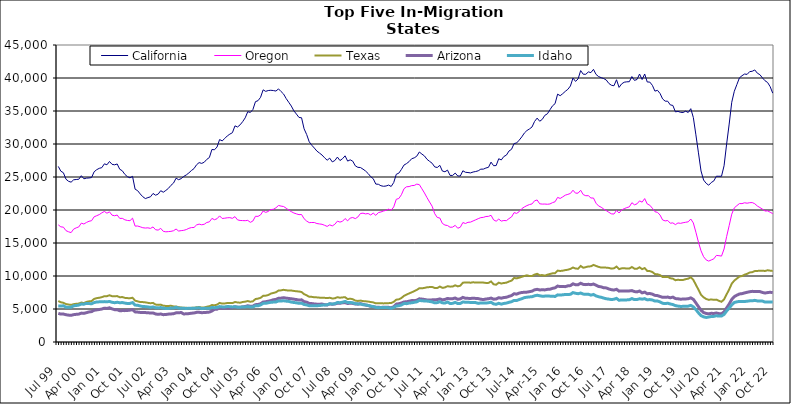
| Category | California | Oregon | Texas | Arizona | Idaho |
|---|---|---|---|---|---|
| Jul 99 | 26605 | 17749 | 6209 | 4339 | 5471 |
| Aug 99 | 25882 | 17447 | 6022 | 4228 | 5444 |
| Sep 99 | 25644 | 17401 | 5941 | 4237 | 5488 |
| Oct 99 | 24669 | 16875 | 5751 | 4134 | 5279 |
| Nov 99 | 24353 | 16701 | 5680 | 4073 | 5260 |
| Dec 99 | 24218 | 16570 | 5619 | 4042 | 5269 |
| Jan 00 | 24574 | 17109 | 5736 | 4142 | 5485 |
| Feb 00 | 24620 | 17295 | 5789 | 4192 | 5530 |
| Mar 00 | 24655 | 17436 | 5826 | 4226 | 5590 |
| Apr 00 | 25195 | 18009 | 5980 | 4375 | 5748 |
| May 00 | 24730 | 17875 | 5897 | 4337 | 5729 |
| Jun 00 | 24825 | 18113 | 6070 | 4444 | 5853 |
| Jul 00 | 24857 | 18294 | 6163 | 4555 | 5824 |
| Aug 00 | 24913 | 18376 | 6199 | 4603 | 5788 |
| Sep 00 | 25792 | 18971 | 6529 | 4804 | 5976 |
| Oct 00 | 26106 | 19135 | 6643 | 4870 | 6058 |
| Nov 00 | 26315 | 19306 | 6705 | 4926 | 6085 |
| Dec 00 | 26415 | 19570 | 6793 | 4991 | 6096 |
| Jan 01 | 26995 | 19781 | 6942 | 5122 | 6119 |
| Feb 01 | 26851 | 19519 | 6948 | 5089 | 6090 |
| Mar 01 | 27352 | 19720 | 7080 | 5180 | 6143 |
| Apr 01 | 26918 | 19221 | 6943 | 5020 | 6020 |
| May 01 | 26848 | 19126 | 6924 | 4899 | 5950 |
| Jun 01 | 26974 | 19241 | 6959 | 4895 | 6019 |
| Jul 01 | 26172 | 18725 | 6778 | 4737 | 5951 |
| Aug 01 | 25943 | 18736 | 6810 | 4757 | 5973 |
| Sep 01 | 25399 | 18514 | 6688 | 4753 | 5895 |
| Oct 01 | 25050 | 18415 | 6650 | 4780 | 5833 |
| Nov 01 | 24873 | 18381 | 6631 | 4826 | 5850 |
| Dec 01 | 25099 | 18765 | 6708 | 4898 | 5969 |
| Jan 02 | 23158 | 17561 | 6261 | 4560 | 5595 |
| Feb 02 | 22926 | 17573 | 6162 | 4531 | 5560 |
| Mar 02 | 22433 | 17452 | 6052 | 4481 | 5458 |
| Apr 02 | 22012 | 17314 | 6046 | 4458 | 5380 |
| May 02 | 21733 | 17267 | 6007 | 4452 | 5358 |
| Jun 02 | 21876 | 17298 | 5933 | 4444 | 5315 |
| Jul 02 | 21997 | 17209 | 5873 | 4383 | 5243 |
| Aug 02 | 22507 | 17436 | 5929 | 4407 | 5315 |
| Sep 02 | 22244 | 17010 | 5672 | 4248 | 5192 |
| Oct 02 | 22406 | 16952 | 5625 | 4191 | 5167 |
| Nov 02 | 22922 | 17223 | 5663 | 4242 | 5221 |
| Dec 02 | 22693 | 16770 | 5499 | 4142 | 5120 |
| Jan 03 | 22964 | 16694 | 5463 | 4166 | 5089 |
| Feb 03 | 23276 | 16727 | 5461 | 4226 | 5077 |
| Mar 03 | 23736 | 16766 | 5486 | 4251 | 5145 |
| Apr 03 | 24079 | 16859 | 5389 | 4289 | 5145 |
| May 03 | 24821 | 17117 | 5378 | 4415 | 5254 |
| Jun 03 | 24592 | 16812 | 5273 | 4426 | 5135 |
| Jul 03 | 24754 | 16875 | 5226 | 4466 | 5124 |
| Aug 03 | 25092 | 16922 | 5181 | 4244 | 5100 |
| Sep 03 | 25316 | 17036 | 5181 | 4279 | 5086 |
| Oct 03 | 25622 | 17228 | 5139 | 4301 | 5110 |
| Nov 03 | 25984 | 17335 | 5175 | 4362 | 5091 |
| Dec 03 | 26269 | 17350 | 5189 | 4396 | 5113 |
| Jan 04 | 26852 | 17734 | 5255 | 4492 | 5152 |
| Feb 04 | 27184 | 17860 | 5301 | 4502 | 5183 |
| Mar 04 | 27062 | 17757 | 5227 | 4443 | 5056 |
| Apr 04 | 27238 | 17840 | 5227 | 4461 | 5104 |
| May 04 | 27671 | 18113 | 5345 | 4493 | 5095 |
| Jun 04 | 27949 | 18201 | 5416 | 4532 | 5103 |
| Jul 04 | 29172 | 18727 | 5597 | 4697 | 5231 |
| Aug 04 | 29122 | 18529 | 5561 | 4945 | 5197 |
| Sep 04 | 29542 | 18678 | 5656 | 4976 | 5237 |
| Oct 04 | 30674 | 19108 | 5922 | 5188 | 5363 |
| Nov 04 | 30472 | 18716 | 5823 | 5106 | 5321 |
| Dec 04 | 30831 | 18755 | 5838 | 5135 | 5312 |
| Jan 05 | 31224 | 18823 | 5906 | 5155 | 5374 |
| Feb 05 | 31495 | 18842 | 5898 | 5168 | 5357 |
| Mar 05 | 31714 | 18738 | 5894 | 5212 | 5313 |
| Apr 05 | 32750 | 18998 | 6060 | 5340 | 5350 |
| May 05 | 32575 | 18504 | 5989 | 5269 | 5276 |
| Jun 05 | 32898 | 18414 | 5954 | 5252 | 5271 |
| Jul 05 | 33384 | 18395 | 6062 | 5322 | 5322 |
| Aug 05 | 33964 | 18381 | 6113 | 5375 | 5316 |
| Sep 05 | 34897 | 18426 | 6206 | 5493 | 5362 |
| Oct 05 | 34780 | 18132 | 6100 | 5408 | 5308 |
| Nov 05 | 35223 | 18332 | 6162 | 5434 | 5314 |
| Dec 05 | 36415 | 19047 | 6508 | 5658 | 5487 |
| Jan 06 | 36567 | 19032 | 6576 | 5688 | 5480 |
| Feb 06 | 37074 | 19257 | 6692 | 5792 | 5616 |
| Mar 06 | 38207 | 19845 | 6993 | 6052 | 5850 |
| Apr 06 | 37976 | 19637 | 7024 | 6101 | 5864 |
| May 06 | 38099 | 19781 | 7114 | 6178 | 5943 |
| Jun 06 | 38141 | 20061 | 7331 | 6276 | 6018 |
| Jul 06 | 38097 | 20111 | 7431 | 6399 | 6046 |
| Aug 06 | 38021 | 20333 | 7542 | 6450 | 6064 |
| Sep 06 | 38349 | 20686 | 7798 | 6627 | 6232 |
| Oct 06 | 37947 | 20591 | 7825 | 6647 | 6216 |
| Nov 06 | 37565 | 20526 | 7907 | 6707 | 6244 |
| Dec 06 | 36884 | 20272 | 7840 | 6648 | 6192 |
| Jan 07 | 36321 | 19984 | 7789 | 6597 | 6151 |
| Feb 07 | 35752 | 19752 | 7799 | 6554 | 6048 |
| Mar 07 | 35025 | 19547 | 7737 | 6487 | 5989 |
| Apr 07 | 34534 | 19412 | 7685 | 6430 | 5937 |
| May 07 | 34022 | 19296 | 7654 | 6353 | 5858 |
| Jun 07 | 33974 | 19318 | 7577 | 6390 | 5886 |
| Jul 07 | 32298 | 18677 | 7250 | 6117 | 5682 |
| Aug 07 | 31436 | 18322 | 7070 | 6034 | 5617 |
| Sep 07 | 30331 | 18087 | 6853 | 5847 | 5500 |
| Oct 07 | 29813 | 18108 | 6839 | 5821 | 5489 |
| Nov 07 | 29384 | 18105 | 6777 | 5769 | 5481 |
| Dec 07 | 28923 | 17949 | 6760 | 5733 | 5499 |
| Jan 08 | 28627 | 17890 | 6721 | 5732 | 5521 |
| Feb 08 | 28328 | 17834 | 6719 | 5749 | 5579 |
| Mar 08 | 27911 | 17680 | 6690 | 5650 | 5614 |
| Apr 08 | 27543 | 17512 | 6656 | 5612 | 5635 |
| May 08 | 27856 | 17754 | 6705 | 5774 | 5798 |
| Jun 08 | 27287 | 17589 | 6593 | 5717 | 5745 |
| Jul 08 | 27495 | 17834 | 6623 | 5761 | 5807 |
| Aug 08 | 28018 | 18309 | 6789 | 5867 | 5982 |
| Sep-08 | 27491 | 18164 | 6708 | 5864 | 5954 |
| Oct 08 | 27771 | 18291 | 6755 | 5942 | 6032 |
| Nov 08 | 28206 | 18706 | 6787 | 5970 | 6150 |
| Dec 08 | 27408 | 18353 | 6505 | 5832 | 5975 |
| Jan 09 | 27601 | 18778 | 6569 | 5890 | 5995 |
| Feb 09 | 27394 | 18863 | 6483 | 5845 | 5936 |
| Mar 09 | 26690 | 18694 | 6273 | 5751 | 5806 |
| Apr 09 | 26461 | 18943 | 6222 | 5735 | 5777 |
| May 09 | 26435 | 19470 | 6272 | 5819 | 5767 |
| Jun 09 | 26187 | 19522 | 6199 | 5700 | 5649 |
| Jul 09 | 25906 | 19408 | 6171 | 5603 | 5617 |
| Aug 09 | 25525 | 19469 | 6128 | 5533 | 5540 |
| Sep 09 | 25050 | 19249 | 6059 | 5405 | 5437 |
| Oct 09 | 24741 | 19529 | 6004 | 5349 | 5369 |
| Nov 09 | 23928 | 19187 | 5854 | 5271 | 5248 |
| Dec 09 | 23899 | 19607 | 5886 | 5261 | 5195 |
| Jan 10 | 23676 | 19703 | 5881 | 5232 | 5234 |
| Feb 10 | 23592 | 19845 | 5850 | 5272 | 5236 |
| Mar 10 | 23634 | 19946 | 5864 | 5278 | 5219 |
| Apr 10 | 23774 | 20134 | 5889 | 5257 | 5201 |
| May 10 | 23567 | 19966 | 5897 | 5172 | 5105 |
| Jun 10 | 24166 | 20464 | 6087 | 5356 | 5237 |
| Jul 10 | 25410 | 21627 | 6417 | 5742 | 5452 |
| Aug 10 | 25586 | 21744 | 6465 | 5797 | 5491 |
| Sep 10 | 26150 | 22314 | 6667 | 5907 | 5609 |
| Oct 10 | 26807 | 23219 | 6986 | 6070 | 5831 |
| Nov 10 | 27033 | 23520 | 7179 | 6100 | 5810 |
| Dec 10 | 27332 | 23551 | 7361 | 6182 | 5898 |
| Jan 11 | 27769 | 23697 | 7525 | 6276 | 5938 |
| Feb 11 | 27898 | 23718 | 7708 | 6267 | 6016 |
| Mar 11 | 28155 | 23921 | 7890 | 6330 | 6081 |
| Apr 11 | 28790 | 23847 | 8146 | 6544 | 6305 |
| May 11 | 28471 | 23215 | 8131 | 6502 | 6248 |
| Jun 11 | 28191 | 22580 | 8199 | 6445 | 6217 |
| Jul 11 | 27678 | 21867 | 8291 | 6368 | 6202 |
| Aug 11 | 27372 | 21203 | 8321 | 6356 | 6146 |
| Sep 11 | 27082 | 20570 | 8341 | 6387 | 6075 |
| Oct 11 | 26528 | 19442 | 8191 | 6402 | 5932 |
| Nov 11 | 26440 | 18872 | 8176 | 6426 | 5968 |
| Dec 11 | 26770 | 18784 | 8401 | 6533 | 6106 |
| Jan 12 | 25901 | 17963 | 8202 | 6390 | 5933 |
| Feb 12 | 25796 | 17718 | 8266 | 6456 | 5900 |
| Mar 12 | 26042 | 17647 | 8456 | 6600 | 6054 |
| Apr 12 | 25239 | 17386 | 8388 | 6534 | 5838 |
| May 12 | 25238 | 17407 | 8401 | 6558 | 5854 |
| Jun 12 | 25593 | 17673 | 8594 | 6669 | 6009 |
| Jul 12 | 25155 | 17237 | 8432 | 6474 | 5817 |
| Aug 12 | 25146 | 17391 | 8536 | 6539 | 5842 |
| Sep 12 | 25942 | 18102 | 8989 | 6759 | 6061 |
| Oct 12 | 25718 | 17953 | 9012 | 6618 | 6027 |
| Nov 12 | 25677 | 18134 | 9032 | 6611 | 6009 |
| Dec 12 | 25619 | 18166 | 8981 | 6601 | 5999 |
| Jan 13 | 25757 | 18344 | 9051 | 6627 | 5989 |
| Feb-13 | 25830 | 18512 | 9001 | 6606 | 5968 |
| Mar-13 | 25940 | 18689 | 9021 | 6577 | 5853 |
| Apr 13 | 26187 | 18844 | 9013 | 6478 | 5925 |
| May 13 | 26192 | 18884 | 9003 | 6431 | 5924 |
| Jun-13 | 26362 | 19013 | 8948 | 6508 | 5896 |
| Jul 13 | 26467 | 19037 | 8958 | 6559 | 5948 |
| Aug 13 | 27253 | 19198 | 9174 | 6655 | 6020 |
| Sep 13 | 26711 | 18501 | 8747 | 6489 | 5775 |
| Oct 13 | 26733 | 18301 | 8681 | 6511 | 5711 |
| Nov 13 | 27767 | 18620 | 8989 | 6709 | 5860 |
| Dec 13 | 27583 | 18320 | 8863 | 6637 | 5740 |
| Jan 14 | 28107 | 18409 | 8939 | 6735 | 5843 |
| Feb-14 | 28313 | 18383 | 8989 | 6779 | 5893 |
| Mar 14 | 28934 | 18696 | 9160 | 6918 | 6015 |
| Apr 14 | 29192 | 18946 | 9291 | 7036 | 6099 |
| May 14 | 30069 | 19603 | 9701 | 7314 | 6304 |
| Jun 14 | 30163 | 19487 | 9641 | 7252 | 6293 |
| Jul-14 | 30587 | 19754 | 9752 | 7415 | 6427 |
| Aug-14 | 31074 | 20201 | 9882 | 7499 | 6557 |
| Sep 14 | 31656 | 20459 | 9997 | 7536 | 6719 |
| Oct 14 | 32037 | 20663 | 10109 | 7555 | 6786 |
| Nov 14 | 32278 | 20825 | 9992 | 7628 | 6831 |
| Dec 14 | 32578 | 20918 | 10006 | 7705 | 6860 |
| Jan 15 | 33414 | 21396 | 10213 | 7906 | 7000 |
| Feb 15 | 33922 | 21518 | 10337 | 7982 | 7083 |
| Mar 15 | 33447 | 20942 | 10122 | 7891 | 7006 |
| Apr-15 | 33731 | 20893 | 10138 | 7906 | 6931 |
| May 15 | 34343 | 20902 | 10053 | 7895 | 6952 |
| Jun-15 | 34572 | 20870 | 10192 | 7973 | 6966 |
| Jul 15 | 35185 | 20916 | 10303 | 8000 | 6949 |
| Aug 15 | 35780 | 21115 | 10399 | 8126 | 6938 |
| Sep 15 | 36109 | 21246 | 10428 | 8207 | 6896 |
| Oct 15 | 37555 | 21908 | 10813 | 8477 | 7140 |
| Nov 15 | 37319 | 21750 | 10763 | 8390 | 7112 |
| Dec 15 | 37624 | 21990 | 10807 | 8395 | 7149 |
| Jan 16 | 37978 | 22248 | 10892 | 8388 | 7201 |
| Feb 16 | 38285 | 22369 | 10951 | 8508 | 7192 |
| Mar 16 | 38792 | 22506 | 11075 | 8547 | 7226 |
| Apr 16 | 39994 | 22999 | 11286 | 8815 | 7487 |
| May 16 | 39488 | 22548 | 11132 | 8673 | 7382 |
| Jun 16 | 39864 | 22556 | 11100 | 8682 | 7315 |
| Jul 16 | 41123 | 22989 | 11516 | 8903 | 7420 |
| Aug 16 | 40573 | 22333 | 11251 | 8731 | 7261 |
| Sep 16 | 40560 | 22162 | 11340 | 8692 | 7216 |
| Oct 16 | 40923 | 22172 | 11456 | 8742 | 7233 |
| Nov 16 | 40817 | 21818 | 11459 | 8685 | 7101 |
| Dec 16 | 41311 | 21815 | 11681 | 8783 | 7203 |
| Jan 17 | 40543 | 21029 | 11524 | 8609 | 6982 |
| Feb 17 | 40218 | 20613 | 11385 | 8416 | 6852 |
| Mar 17 | 40052 | 20425 | 11276 | 8354 | 6775 |
| Apr 17 | 39913 | 20147 | 11297 | 8218 | 6653 |
| May 17 | 39695 | 19910 | 11265 | 8196 | 6552 |
| Jun 17 | 39177 | 19650 | 11225 | 8034 | 6500 |
| Jul 17 | 38901 | 19419 | 11115 | 7923 | 6429 |
| Aug 17 | 38827 | 19389 | 11168 | 7867 | 6479 |
| Sep 17 | 39736 | 19936 | 11426 | 7991 | 6609 |
| Oct 17 | 38576 | 19547 | 11041 | 7708 | 6315 |
| Nov 17 | 39108 | 20013 | 11158 | 7746 | 6381 |
| Dec 17 | 39359 | 20202 | 11185 | 7743 | 6366 |
| Jan 18 | 39420 | 20362 | 11118 | 7736 | 6380 |
| Feb 18 | 39440 | 20476 | 11128 | 7741 | 6407 |
| Mar 18 | 40218 | 21106 | 11362 | 7789 | 6578 |
| Apr 18 | 39637 | 20788 | 11111 | 7642 | 6423 |
| May 18 | 39777 | 20933 | 11097 | 7591 | 6430 |
| Jun 18 | 40602 | 21381 | 11317 | 7721 | 6554 |
| Jul 18 | 39767 | 21189 | 11038 | 7445 | 6489 |
| Aug 18 | 40608 | 21729 | 11200 | 7560 | 6569 |
| Sep 18 | 39395 | 20916 | 10772 | 7318 | 6383 |
| Oct 18 | 39383 | 20724 | 10740 | 7344 | 6429 |
| Nov 18 | 38891 | 20265 | 10605 | 7255 | 6365 |
| Dec 18 | 38013 | 19741 | 10292 | 7069 | 6205 |
| Jan 19 | 38130 | 19643 | 10261 | 7032 | 6203 |
| Feb 19 | 37658 | 19237 | 10132 | 6892 | 6073 |
| Mar 19 | 36831 | 18492 | 9848 | 6766 | 5863 |
| Apr 19 | 36492 | 18349 | 9839 | 6763 | 5827 |
| May 19 | 36481 | 18407 | 9867 | 6809 | 5873 |
| Jun 19 | 35925 | 17998 | 9661 | 6698 | 5761 |
| Jul 19 | 35843 | 18049 | 9598 | 6800 | 5673 |
| Aug 19 | 34870 | 17785 | 9361 | 6577 | 5512 |
| Sep 19 | 34945 | 18038 | 9428 | 6547 | 5437 |
| Oct 19 | 34802 | 17977 | 9385 | 6483 | 5390 |
| Nov 19 | 34775 | 18072 | 9403 | 6511 | 5401 |
| Dec 19 | 34976 | 18140 | 9518 | 6521 | 5419 |
| Jan 20 | 34774 | 18209 | 9594 | 6561 | 5434 |
| Feb 20 | 35352 | 18632 | 9804 | 6682 | 5543 |
| Mar 20 | 34013 | 18041 | 9411 | 6464 | 5330 |
| Apr 20 | 31385 | 16629 | 8666 | 5922 | 4906 |
| May 20 | 28657 | 15123 | 7927 | 5355 | 4419 |
| Jun 20 | 25915 | 13817 | 7164 | 4815 | 3992 |
| Jul 20 | 24545 | 12926 | 6776 | 4457 | 3810 |
| Aug 20 | 24048 | 12443 | 6521 | 4326 | 3720 |
| Sep 20 | 23756 | 12258 | 6386 | 4266 | 3784 |
| Oct 20 | 24166 | 12429 | 6452 | 4347 | 3861 |
| Nov 20 | 24404 | 12597 | 6386 | 4324 | 3883 |
| Dec 20 | 25120 | 13122 | 6420 | 4394 | 3974 |
| Jan 21 | 25111 | 13080 | 6236 | 4304 | 3924 |
| Feb 21 | 25114 | 13015 | 6094 | 4260 | 3930 |
| Mar 21 | 26701 | 14096 | 6455 | 4567 | 4185 |
| Apr 21 | 29998 | 15978 | 7222 | 5164 | 4697 |
| May 21 | 33020 | 17641 | 7969 | 5748 | 5148 |
| Jun 21 | 36320 | 19369 | 8840 | 6450 | 5628 |
| Jul 21 | 37989 | 20320 | 9306 | 6877 | 5984 |
| Aug 21 | 39007 | 20657 | 9615 | 7094 | 6084 |
| Sep 21 | 40023 | 20974 | 9914 | 7277 | 6151 |
| Oct 21 | 40348 | 20966 | 10003 | 7327 | 6140 |
| Nov 21 | 40599 | 21096 | 10203 | 7437 | 6136 |
| Dec 21 | 40548 | 21032 | 10328 | 7532 | 6183 |
| Jan 22 | 40967 | 21106 | 10535 | 7618 | 6237 |
| Feb 22 | 41019 | 21125 | 10579 | 7673 | 6236 |
| Mar 22 | 41220 | 20949 | 10751 | 7660 | 6310 |
| Apr 22 | 40730 | 20602 | 10772 | 7661 | 6221 |
| May 22 | 40504 | 20370 | 10792 | 7636 | 6210 |
| Jun 22 | 40013 | 20127 | 10802 | 7504 | 6199 |
| Jul 22 | 39582 | 19846 | 10761 | 7419 | 6050 |
| Aug 22 | 39321 | 19865 | 10868 | 7487 | 6071 |
| Sep 22 | 38685 | 19666 | 10811 | 7536 | 6074 |
| Oct 22 | 37700 | 19450 | 10764 | 7469 | 6042 |